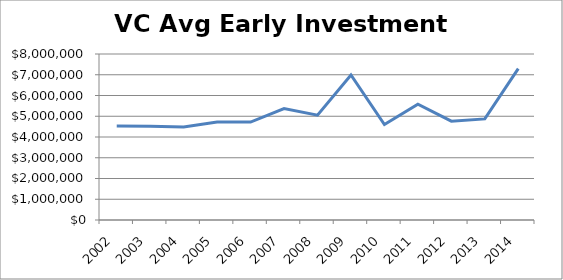
| Category | Series 0 |
|---|---|
| 2002.0 | 4529076.397 |
| 2003.0 | 4515605.493 |
| 2004.0 | 4480620.155 |
| 2005.0 | 4723453.909 |
| 2006.0 | 4719000 |
| 2007.0 | 5372791.519 |
| 2008.0 | 5053275.109 |
| 2009.0 | 6989764.585 |
| 2010.0 | 4600938.967 |
| 2011.0 | 5578548.896 |
| 2012.0 | 4761035.903 |
| 2013.0 | 4872191.712 |
| 2014.0 | 7292626.728 |